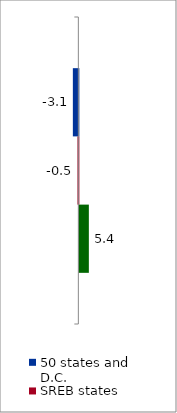
| Category | 50 states and D.C. | SREB states | State |
|---|---|---|---|
| 2014 to 2019 | -3.133 | -0.506 | 5.405 |